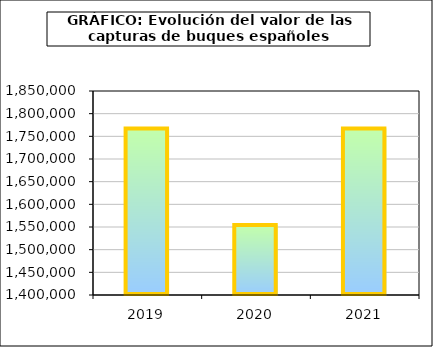
| Category | Series1 |
|---|---|
| 2019.0 | 1767392.171 |
| 2020.0 | 1554414.547 |
| 2021.0 | 1767191.289 |